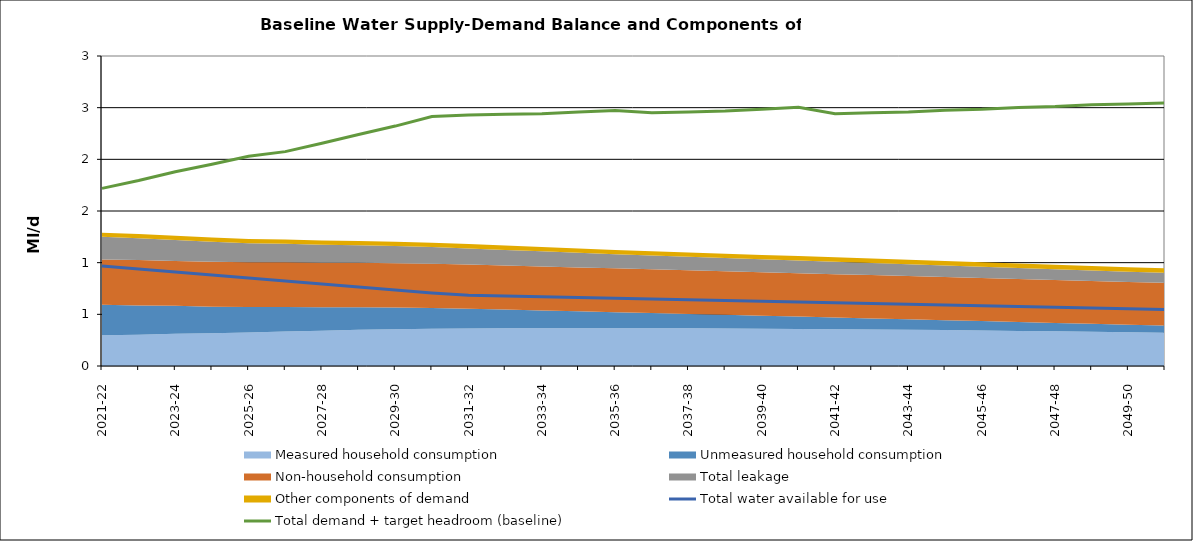
| Category | Total water available for use | Total demand + target headroom (baseline) |
|---|---|---|
| 2020-21 | 0.967 | 1.719 |
| 2021-22 | 0.938 | 1.795 |
| 2022-23 | 0.909 | 1.88 |
| 2023-24 | 0.88 | 1.953 |
| 2024-25 | 0.851 | 2.03 |
| 2025-26 | 0.822 | 2.075 |
| 2026-27 | 0.793 | 2.155 |
| 2027-28 | 0.764 | 2.24 |
| 2028-29 | 0.735 | 2.322 |
| 2029-30 | 0.706 | 2.414 |
| 2030-31 | 0.685 | 2.43 |
| 2031-32 | 0.677 | 2.436 |
| 2032-33 | 0.67 | 2.441 |
| 2033-34 | 0.663 | 2.457 |
| 2034-35 | 0.656 | 2.473 |
| 2035-36 | 0.648 | 2.451 |
| 2036-37 | 0.641 | 2.459 |
| 2037-38 | 0.634 | 2.467 |
| 2038-39 | 0.627 | 2.485 |
| 2039-40 | 0.619 | 2.504 |
| 2040-41 | 0.612 | 2.442 |
| 2041-42 | 0.605 | 2.45 |
| 2042-43 | 0.598 | 2.458 |
| 2043-44 | 0.591 | 2.476 |
| 2044-45 | 0.583 | 2.484 |
| 2045-46 | 0.576 | 2.502 |
| 2046-47 | 0.569 | 2.51 |
| 2047-48 | 0.562 | 2.529 |
| 2048-49 | 0.554 | 2.537 |
| 2049-50 | 0.547 | 2.545 |